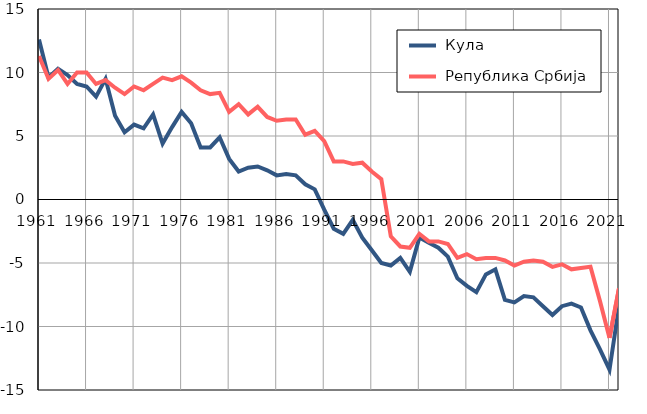
| Category |  Кула |  Република Србија |
|---|---|---|
| 1961.0 | 12.6 | 11.3 |
| 1962.0 | 9.6 | 9.5 |
| 1963.0 | 10.3 | 10.2 |
| 1964.0 | 9.8 | 9.1 |
| 1965.0 | 9.1 | 10 |
| 1966.0 | 8.9 | 10 |
| 1967.0 | 8.1 | 9.1 |
| 1968.0 | 9.5 | 9.4 |
| 1969.0 | 6.6 | 8.8 |
| 1970.0 | 5.3 | 8.3 |
| 1971.0 | 5.9 | 8.9 |
| 1972.0 | 5.6 | 8.6 |
| 1973.0 | 6.7 | 9.1 |
| 1974.0 | 4.4 | 9.6 |
| 1975.0 | 5.7 | 9.4 |
| 1976.0 | 6.9 | 9.7 |
| 1977.0 | 6 | 9.2 |
| 1978.0 | 4.1 | 8.6 |
| 1979.0 | 4.1 | 8.3 |
| 1980.0 | 4.9 | 8.4 |
| 1981.0 | 3.2 | 6.9 |
| 1982.0 | 2.2 | 7.5 |
| 1983.0 | 2.5 | 6.7 |
| 1984.0 | 2.6 | 7.3 |
| 1985.0 | 2.3 | 6.5 |
| 1986.0 | 1.9 | 6.2 |
| 1987.0 | 2 | 6.3 |
| 1988.0 | 1.9 | 6.3 |
| 1989.0 | 1.2 | 5.1 |
| 1990.0 | 0.8 | 5.4 |
| 1991.0 | -0.8 | 4.6 |
| 1992.0 | -2.3 | 3 |
| 1993.0 | -2.7 | 3 |
| 1994.0 | -1.6 | 2.8 |
| 1995.0 | -3 | 2.9 |
| 1996.0 | -4 | 2.2 |
| 1997.0 | -5 | 1.6 |
| 1998.0 | -5.2 | -2.9 |
| 1999.0 | -4.6 | -3.7 |
| 2000.0 | -5.7 | -3.8 |
| 2001.0 | -3 | -2.7 |
| 2002.0 | -3.4 | -3.3 |
| 2003.0 | -3.8 | -3.3 |
| 2004.0 | -4.5 | -3.5 |
| 2005.0 | -6.2 | -4.6 |
| 2006.0 | -6.8 | -4.3 |
| 2007.0 | -7.3 | -4.7 |
| 2008.0 | -5.9 | -4.6 |
| 2009.0 | -5.5 | -4.6 |
| 2010.0 | -7.9 | -4.8 |
| 2011.0 | -8.1 | -5.2 |
| 2012.0 | -7.6 | -4.9 |
| 2013.0 | -7.7 | -4.8 |
| 2014.0 | -8.4 | -4.9 |
| 2015.0 | -9.1 | -5.3 |
| 2016.0 | -8.4 | -5.1 |
| 2017.0 | -8.2 | -5.5 |
| 2018.0 | -8.5 | -5.4 |
| 2019.0 | -10.3 | -5.3 |
| 2020.0 | -11.8 | -8 |
| 2021.0 | -13.4 | -10.9 |
| 2022.0 | -8.4 | -7 |